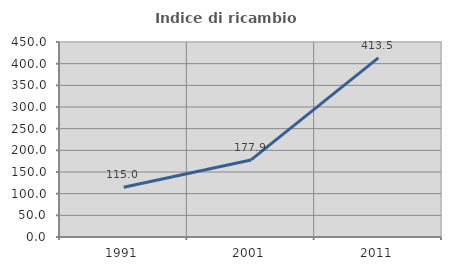
| Category | Indice di ricambio occupazionale  |
|---|---|
| 1991.0 | 115.015 |
| 2001.0 | 177.874 |
| 2011.0 | 413.485 |